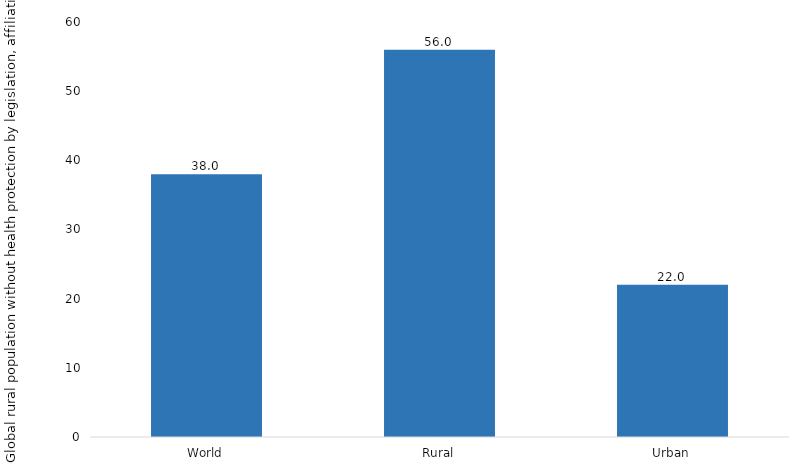
| Category | World Social Protection Report 2017/2018 |
|---|---|
| World | 38 |
| Rural | 56 |
| Urban | 22 |